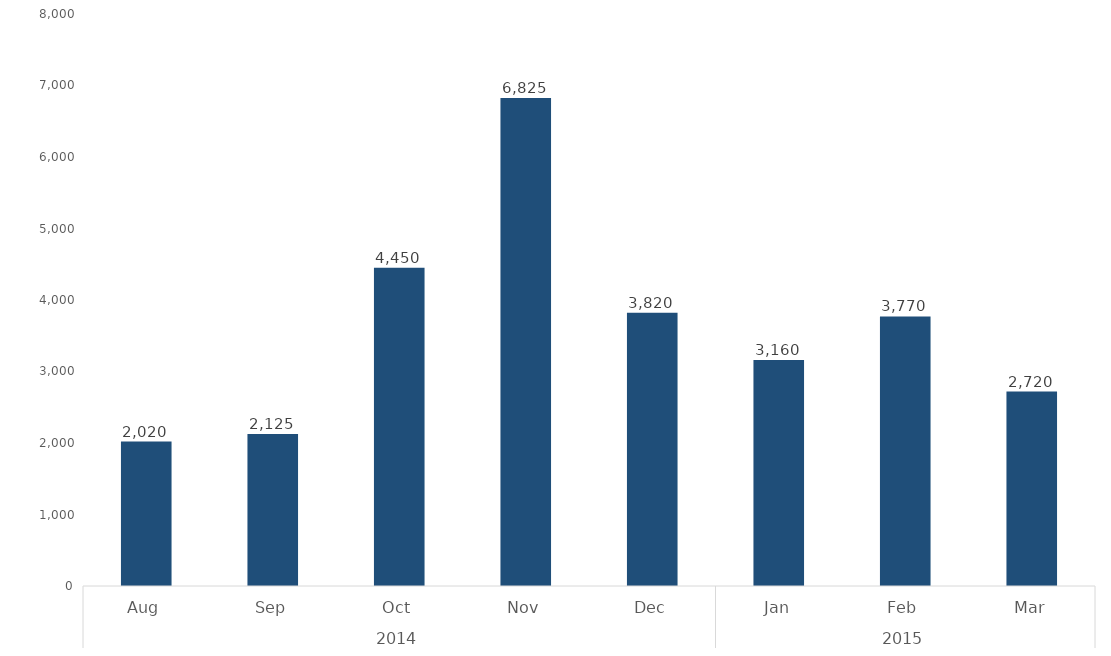
| Category | Total |
|---|---|
| 0 | 2020 |
| 1 | 2125 |
| 2 | 4450 |
| 3 | 6825 |
| 4 | 3820 |
| 5 | 3160 |
| 6 | 3770 |
| 7 | 2720 |